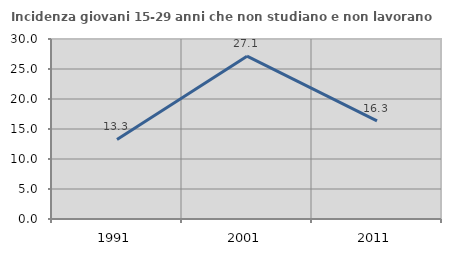
| Category | Incidenza giovani 15-29 anni che non studiano e non lavorano  |
|---|---|
| 1991.0 | 13.265 |
| 2001.0 | 27.143 |
| 2011.0 | 16.346 |